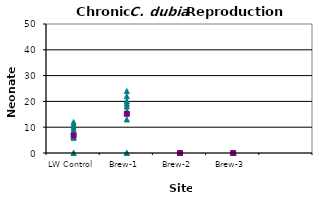
| Category | Series 0 | Neos Rep 2 | Series 2 | Neos Rep 4 | Series 4 | Series 5 | Series 6 | Series 7 | Series 8 | Series 9 | Series 10 |
|---|---|---|---|---|---|---|---|---|---|---|---|
| LW Control | 6 | 8 | 6 | 9 | 6 | 0 | 12 | 10 | 11 | 0 | 6.8 |
| Brew-1 | 13 | 16 | 0 | 24 | 18 | 22 | 0 | 20 | 20 | 19 | 15.2 |
| Brew-2 | 0 | 0 | 0 | 0 | 0 | 0 | 0 | 0 | 0 | 0 | 0 |
| Brew-3 | 0 | 0 | 0 | 0 | 0 | 0 | 0 | 0 | 0 | 0 | 0 |